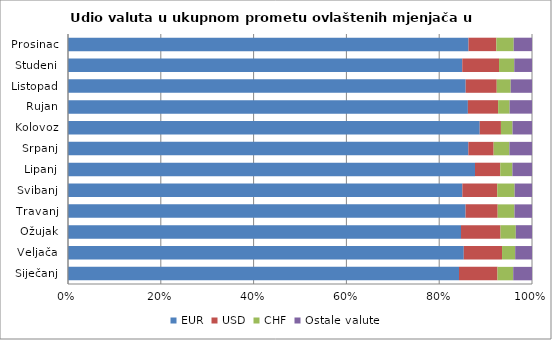
| Category | EUR | USD | CHF | Ostale valute |
|---|---|---|---|---|
| Siječanj | 84.268 | 8.298 | 3.386 | 4.049 |
| Veljača | 85.297 | 8.245 | 2.837 | 3.621 |
| Ožujak | 84.7 | 8.514 | 3.296 | 3.49 |
| Travanj | 85.684 | 6.922 | 3.617 | 3.777 |
| Svibanj | 84.991 | 7.524 | 3.742 | 3.742 |
| Lipanj | 87.721 | 5.439 | 2.619 | 4.221 |
| Srpanj | 86.284 | 5.449 | 3.399 | 4.868 |
| Kolovoz | 88.733 | 4.571 | 2.502 | 4.194 |
| Rujan | 86.182 | 6.515 | 2.483 | 4.819 |
| Listopad | 85.706 | 6.694 | 3.012 | 4.588 |
| Studeni | 84.972 | 7.923 | 3.285 | 3.821 |
| Prosinac | 86.316 | 5.999 | 3.743 | 3.942 |